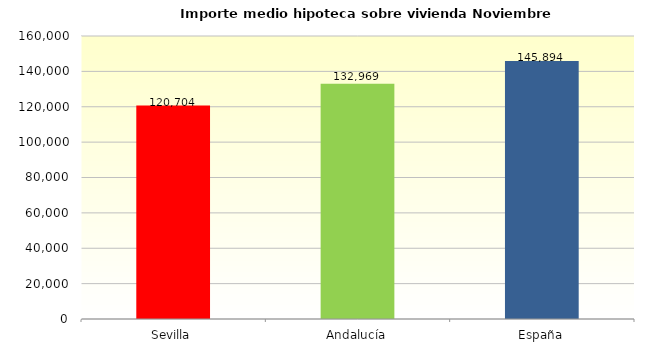
| Category | Series 2 |
|---|---|
| Sevilla | 120703.704 |
| Andalucía | 132969.157 |
| España | 145893.889 |